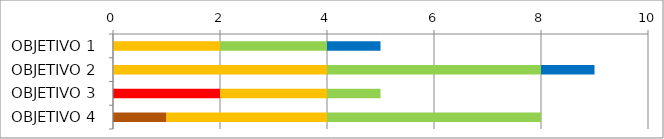
| Category | Series 0 | Series 1 | Series 2 | Series 3 | Series 4 | Series 5 |
|---|---|---|---|---|---|---|
| OBJETIVO 1 | 0 | 0 | 0 | 2 | 2 | 1 |
| OBJETIVO 2 | 0 | 0 | 0 | 4 | 4 | 1 |
| OBJETIVO 3 | 0 | 0 | 2 | 2 | 1 | 0 |
| OBJETIVO 4 | 1 | 0 | 0 | 3 | 4 | 0 |